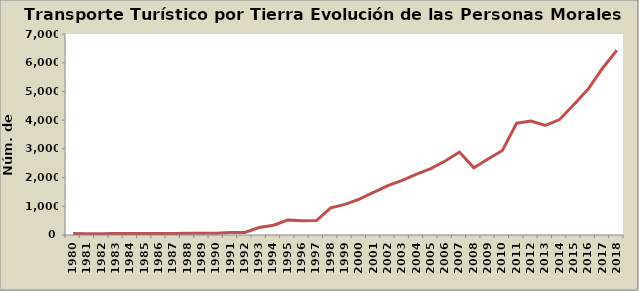
| Category | Series 0 |
|---|---|
| 1980.0 | 50 |
| 1981.0 | 44 |
| 1982.0 | 46 |
| 1983.0 | 54 |
| 1984.0 | 54 |
| 1985.0 | 51 |
| 1986.0 | 56 |
| 1987.0 | 56 |
| 1988.0 | 58 |
| 1989.0 | 60 |
| 1990.0 | 60 |
| 1991.0 | 85 |
| 1992.0 | 90 |
| 1993.0 | 261 |
| 1994.0 | 342 |
| 1995.0 | 523 |
| 1996.0 | 498 |
| 1997.0 | 503 |
| 1998.0 | 948 |
| 1999.0 | 1065 |
| 2000.0 | 1248 |
| 2001.0 | 1483 |
| 2002.0 | 1722 |
| 2003.0 | 1904 |
| 2004.0 | 2120 |
| 2005.0 | 2311 |
| 2006.0 | 2577 |
| 2007.0 | 2888 |
| 2008.0 | 2338 |
| 2009.0 | 2649 |
| 2010.0 | 2942 |
| 2011.0 | 3895 |
| 2012.0 | 3972 |
| 2013.0 | 3820 |
| 2014.0 | 4020 |
| 2015.0 | 4542 |
| 2016.0 | 5080 |
| 2017.0 | 5809 |
| 2018.0 | 6432 |